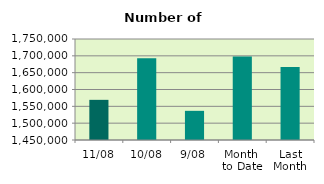
| Category | Series 0 |
|---|---|
| 11/08 | 1569268 |
| 10/08 | 1693114 |
| 9/08 | 1536620 |
| Month 
to Date | 1697906.444 |
| Last
Month | 1667155.619 |